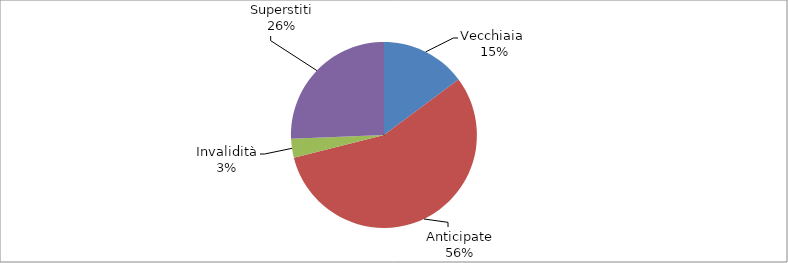
| Category | Series 0 |
|---|---|
| Vecchiaia  | 5387 |
| Anticipate | 20485 |
| Invalidità | 1200 |
| Superstiti | 9336 |